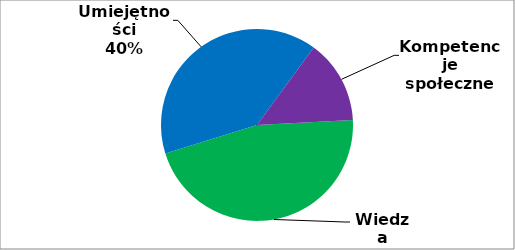
| Category | Series 0 |
|---|---|
| 0 | 261 |
| 1 | 226 |
| 2 | 80 |